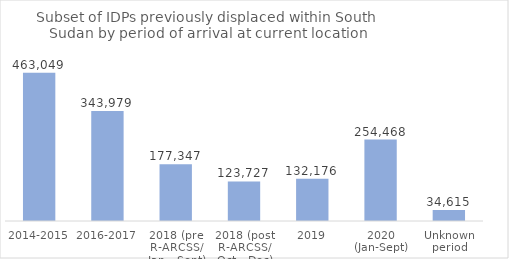
| Category | Total |
|---|---|
| 2014-2015 | 463049 |
| 2016-2017 | 343979 |
| 2018 (pre R-ARCSS/ Jan - Sept) | 177347 |
| 2018 (post R-ARCSS/ Oct - Dec) | 123727 |
| 2019 | 132176 |
| 2020 (Jan-Sept) | 254468 |
| Unknown period | 34615 |